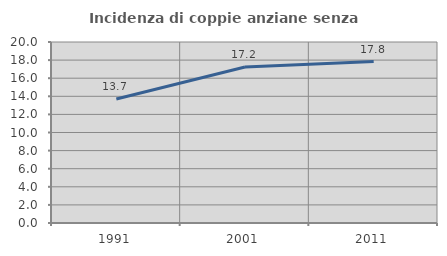
| Category | Incidenza di coppie anziane senza figli  |
|---|---|
| 1991.0 | 13.699 |
| 2001.0 | 17.241 |
| 2011.0 | 17.839 |